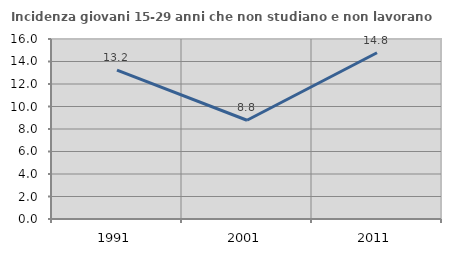
| Category | Incidenza giovani 15-29 anni che non studiano e non lavorano  |
|---|---|
| 1991.0 | 13.231 |
| 2001.0 | 8.779 |
| 2011.0 | 14.781 |